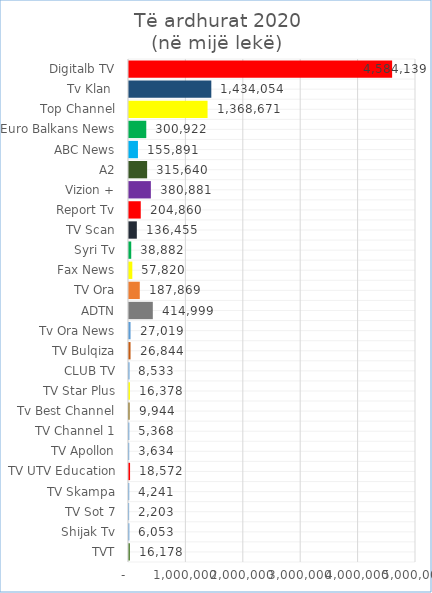
| Category | Series 0 |
|---|---|
| TVT | 16177.683 |
| Shijak Tv | 6052.694 |
| TV Sot 7 | 2202.696 |
| TV Skampa | 4240.896 |
| TV UTV Education | 18571.93 |
| TV Apollon | 3633.788 |
| TV Channel 1 | 5367.846 |
| Tv Best Channel | 9944.304 |
| TV Star Plus | 16377.826 |
| CLUB TV | 8533.262 |
| TV Bulqiza | 26843.855 |
| Tv Ora News | 27018.892 |
| ADTN | 414999.415 |
| TV Ora | 187869.096 |
| Fax News | 57820.21 |
| Syri Tv | 38881.535 |
| TV Scan | 136454.793 |
| Report Tv | 204860.261 |
| Vizion + | 380881.347 |
| A2 | 315640.294 |
| ABC News | 155891.176 |
| Euro Balkans News | 300921.868 |
| Top Channel | 1368671.122 |
| Tv Klan  | 1434054.398 |
| Digitalb TV | 4584138.782 |